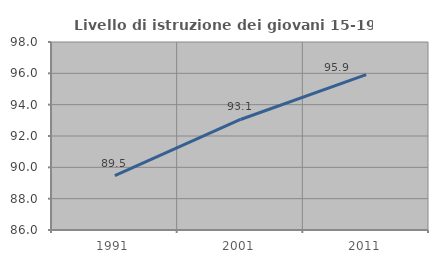
| Category | Livello di istruzione dei giovani 15-19 anni |
|---|---|
| 1991.0 | 89.474 |
| 2001.0 | 93.056 |
| 2011.0 | 95.918 |